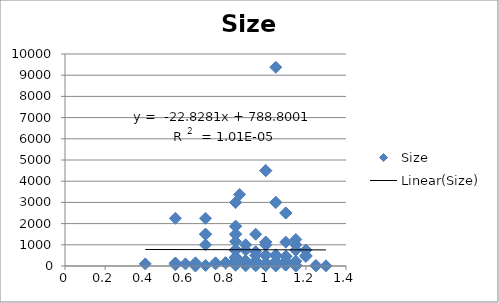
| Category | Size |
|---|---|
| 1.1 | 1125 |
| 1.0 | 150 |
| 0.9 | 250 |
| 0.9 | 225 |
| 1.1 | 50 |
| 1.15 | 1250 |
| 1.2 | 450 |
| 1.2 | 750 |
| 0.9 | 750 |
| 0.95 | 250 |
| 0.95 | 9 |
| 1.1 | 150 |
| 1.15 | 225 |
| 1.15 | 1 |
| 1.05 | 75 |
| 1.05 | 27 |
| 1.15 | 40 |
| 1.15 | 5 |
| 1.2 | 500 |
| 1.15 | 1000 |
| 1.05 | 225 |
| 1.05 | 1 |
| 1.05 | 9375 |
| 0.95 | 1500 |
| 0.95 | 50 |
| 0.95 | 100 |
| 0.75 | 150 |
| 0.9 | 250 |
| 0.95 | 100 |
| 1.0 | 25 |
| 0.7 | 1000 |
| 0.85 | 750 |
| 0.9 | 200 |
| 1.0 | 500 |
| 0.75 | 100 |
| 1.05 | 125 |
| 0.7 | 2250 |
| 0.55 | 60 |
| 0.85 | 35 |
| 1.05 | 525 |
| 0.95 | 150 |
| 0.95 | 675 |
| 0.87 | 3375 |
| 1.3 | 8 |
| 0.7 | 27 |
| 0.55 | 2250 |
| 1.25 | 20 |
| 1.25 | 8 |
| 0.65 | 1 |
| 0.65 | 150 |
| 0.6 | 100 |
| 0.9 | 8 |
| 0.7 | 1500 |
| 0.8 | 150 |
| 0.85 | 1500 |
| 1.1 | 45 |
| 1.05 | 147 |
| 0.95 | 150 |
| 1.05 | 490 |
| 1.2 | 750 |
| 1.0 | 1125 |
| 0.85 | 250 |
| 1.05 | 3000 |
| 1.1 | 2500 |
| 0.85 | 750 |
| 0.85 | 1875 |
| 0.85 | 125 |
| 0.85 | 375 |
| 0.85 | 420 |
| 0.85 | 3000 |
| 0.85 | 750 |
| 0.85 | 750 |
| 1.1 | 450 |
| 1.1 | 450 |
| 1.0 | 30 |
| 0.55 | 135 |
| 1.1 | 225 |
| 1.15 | 750 |
| 1.05 | 60 |
| 1.0 | 4500 |
| 0.7 | 1500 |
| 0.8 | 150 |
| 0.85 | 1500 |
| 1.1 | 45 |
| 1.05 | 147 |
| 0.95 | 150 |
| 1.05 | 490 |
| 1.2 | 750 |
| 1.0 | 1125 |
| 0.85 | 250 |
| 1.05 | 3000 |
| 1.1 | 2500 |
| 0.85 | 1150 |
| 0.85 | 1875 |
| 0.85 | 125 |
| 0.85 | 375 |
| 0.85 | 420 |
| 0.85 | 3000 |
| 0.85 | 750 |
| 0.85 | 750 |
| 1.1 | 450 |
| 1.1 | 450 |
| 1.0 | 30 |
| 0.55 | 135 |
| 1.1 | 225 |
| 1.15 | 750 |
| 1.05 | 60 |
| 1.0 | 4500 |
| 1.0 | 1000 |
| 0.95 | 500 |
| 1.0 | 500 |
| 1.0 | 500 |
| 1.0 | 100 |
| 0.4 | 100 |
| 0.9 | 1000 |
| 1.0 | 1000 |